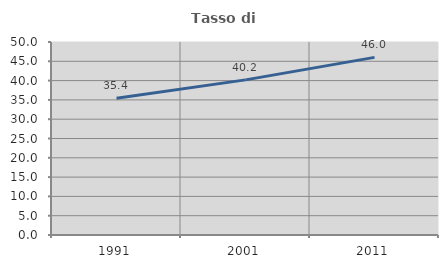
| Category | Tasso di occupazione   |
|---|---|
| 1991.0 | 35.44 |
| 2001.0 | 40.189 |
| 2011.0 | 46.015 |